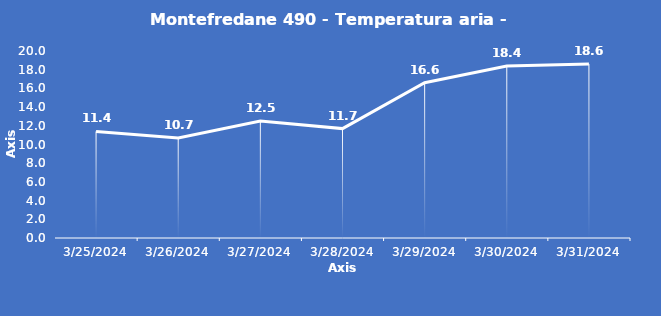
| Category | Montefredane 490 - Temperatura aria - Grezzo (°C) |
|---|---|
| 3/25/24 | 11.4 |
| 3/26/24 | 10.7 |
| 3/27/24 | 12.5 |
| 3/28/24 | 11.7 |
| 3/29/24 | 16.6 |
| 3/30/24 | 18.4 |
| 3/31/24 | 18.6 |